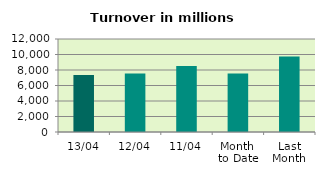
| Category | Series 0 |
|---|---|
| 13/04 | 7366.602 |
| 12/04 | 7533.167 |
| 11/04 | 8505.221 |
| Month 
to Date | 7563.285 |
| Last
Month | 9734.736 |